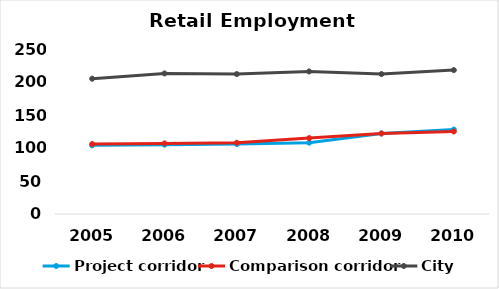
| Category | Project corridor | Comparison corridor | City |
|---|---|---|---|
| 2005.0 | 104 | 106 | 205 |
| 2006.0 | 105 | 107 | 213 |
| 2007.0 | 106 | 108 | 212 |
| 2008.0 | 108 | 115 | 216 |
| 2009.0 | 122 | 122 | 212 |
| 2010.0 | 128 | 125 | 218 |